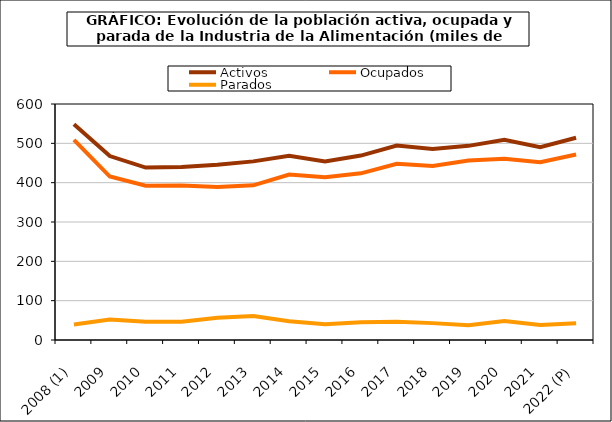
| Category | Activos | Ocupados | Parados |
|---|---|---|---|
| 2008 (1) | 548.65 | 509 | 39.65 |
| 2009 | 467.6 | 415.6 | 52 |
| 2010 | 438.425 | 392.275 | 46.15 |
| 2011 | 439.6 | 393.1 | 46.5 |
| 2012 | 445.725 | 388.925 | 56.8 |
| 2013 | 454.1 | 393.3 | 60.8 |
| 2014 | 468.5 | 420.7 | 47.8 |
| 2015 | 454.1 | 414 | 40.1 |
| 2016 | 468.925 | 423.675 | 45.25 |
| 2017 | 494.275 | 448.025 | 46.25 |
| 2018 | 485.3 | 442.4 | 42.9 |
| 2019 | 493.6 | 456.1 | 37.5 |
| 2020 | 508.9 | 460.5 | 48.4 |
| 2021 | 490.375 | 452 | 38.375 |
| 2022 (P) | 514.275 | 471.5 | 42.775 |